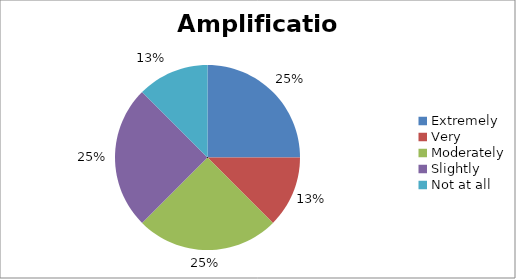
| Category | Amplification |
|---|---|
| Extremely | 2 |
| Very | 1 |
| Moderately | 2 |
| Slightly | 2 |
| Not at all | 1 |